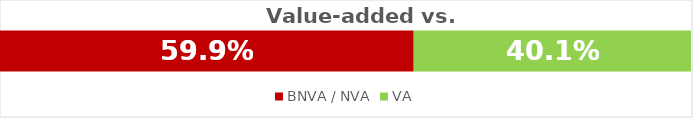
| Category | BNVA / NVA | VA |
|---|---|---|
| 0 | 0.599 | 0.401 |